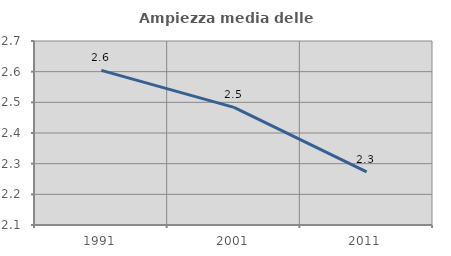
| Category | Ampiezza media delle famiglie |
|---|---|
| 1991.0 | 2.604 |
| 2001.0 | 2.484 |
| 2011.0 | 2.273 |